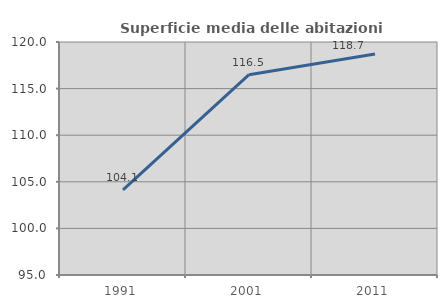
| Category | Superficie media delle abitazioni occupate |
|---|---|
| 1991.0 | 104.126 |
| 2001.0 | 116.494 |
| 2011.0 | 118.713 |